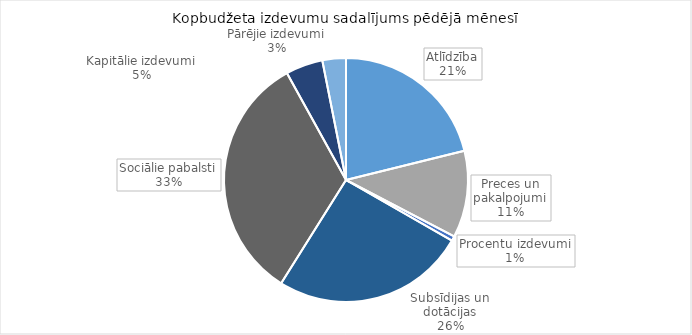
| Category | Series 0 |
|---|---|
| Atlīdzība | 251001.06 |
| Preces un pakalpojumi | 136696.116 |
| Procentu izdevumi | 7220.097 |
| Subsīdijas un dotācijas | 304695.632 |
| Sociālie pabalsti | 392281.606 |
| Kapitālie izdevumi | 58453.955 |
| Pārējie izdevumi | 36992.991 |